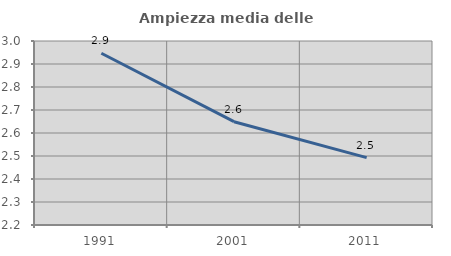
| Category | Ampiezza media delle famiglie |
|---|---|
| 1991.0 | 2.947 |
| 2001.0 | 2.649 |
| 2011.0 | 2.493 |